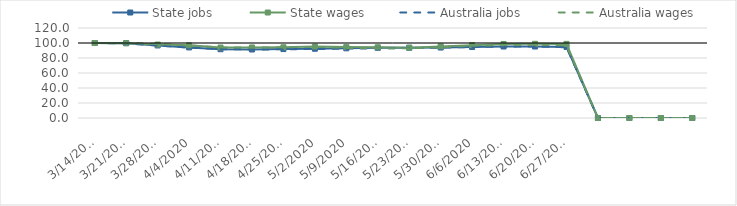
| Category | State jobs | State wages | Australia jobs | Australia wages |
|---|---|---|---|---|
| 14/03/2020 | 100 | 100 | 100 | 100 |
| 21/03/2020 | 99.746 | 99.764 | 99.389 | 100.07 |
| 28/03/2020 | 96.724 | 97.911 | 96.608 | 98.707 |
| 04/04/2020 | 94.109 | 96.866 | 93.828 | 96.765 |
| 11/04/2020 | 91.717 | 93.959 | 91.887 | 94.047 |
| 18/04/2020 | 91.342 | 94.073 | 91.31 | 93.932 |
| 25/04/2020 | 91.908 | 94.331 | 91.6 | 94.326 |
| 02/05/2020 | 92.346 | 95.289 | 91.954 | 94.889 |
| 09/05/2020 | 92.936 | 94.548 | 92.449 | 93.491 |
| 16/05/2020 | 93.547 | 94.3 | 92.97 | 93.144 |
| 23/05/2020 | 93.664 | 93.741 | 93.251 | 92.924 |
| 30/05/2020 | 93.952 | 95.464 | 93.813 | 94.361 |
| 06/06/2020 | 94.684 | 97.061 | 94.668 | 96.401 |
| 13/06/2020 | 95.297 | 98.703 | 95.11 | 97.158 |
| 20/06/2020 | 95.306 | 98.919 | 95.246 | 97.537 |
| 27/06/2020 | 94.789 | 98.824 | 94.328 | 96.826 |